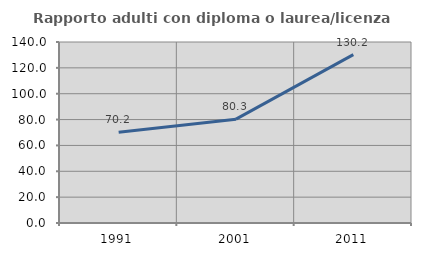
| Category | Rapporto adulti con diploma o laurea/licenza media  |
|---|---|
| 1991.0 | 70.17 |
| 2001.0 | 80.336 |
| 2011.0 | 130.233 |